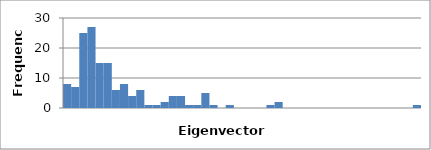
| Category | 8 |
|---|---|
| 0.0 | 8 |
| 0.0010564651162790698 | 7 |
| 0.0021129302325581397 | 25 |
| 0.0031693953488372093 | 27 |
| 0.004225860465116279 | 15 |
| 0.0052823255813953494 | 15 |
| 0.0063387906976744195 | 6 |
| 0.0073952558139534896 | 8 |
| 0.008451720930232559 | 4 |
| 0.009508186046511628 | 6 |
| 0.010564651162790697 | 1 |
| 0.011621116279069766 | 1 |
| 0.012677581395348836 | 2 |
| 0.013734046511627905 | 4 |
| 0.014790511627906974 | 4 |
| 0.015846976744186045 | 1 |
| 0.016903441860465114 | 1 |
| 0.017959906976744183 | 5 |
| 0.019016372093023252 | 1 |
| 0.02007283720930232 | 0 |
| 0.02112930232558139 | 1 |
| 0.02218576744186046 | 0 |
| 0.02324223255813953 | 0 |
| 0.0242986976744186 | 0 |
| 0.025355162790697668 | 0 |
| 0.026411627906976737 | 1 |
| 0.027468093023255806 | 2 |
| 0.028524558139534875 | 0 |
| 0.029581023255813944 | 0 |
| 0.030637488372093014 | 0 |
| 0.03169395348837208 | 0 |
| 0.03275041860465115 | 0 |
| 0.03380688372093022 | 0 |
| 0.03486334883720929 | 0 |
| 0.03591981395348836 | 0 |
| 0.03697627906976743 | 0 |
| 0.0380327441860465 | 0 |
| 0.03908920930232557 | 0 |
| 0.040145674418604636 | 0 |
| 0.041202139534883706 | 0 |
| 0.042258604651162775 | 0 |
| 0.043315069767441844 | 0 |
| 0.04437153488372091 | 0 |
| 0.045428 | 1 |